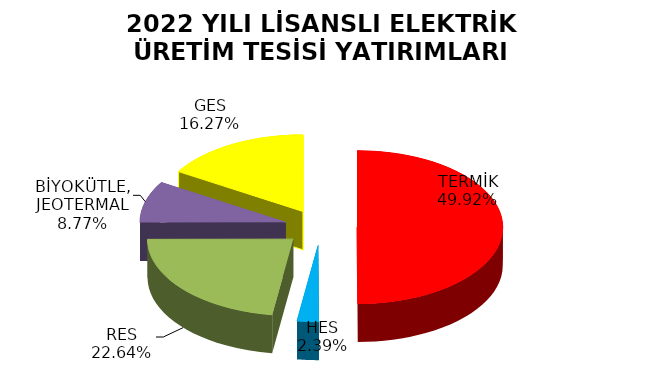
| Category | 2022 YILI LİSANSLI ELEKTRİK ÜRETİM TESİSİ YATIRIMLARI LİSTESİ |
|---|---|
| TERMİK | 1720.935 |
| HES | 82.536 |
| RES | 780.606 |
| BİYOKÜTLE, JEOTERMAL | 302.51 |
| GES | 560.96 |